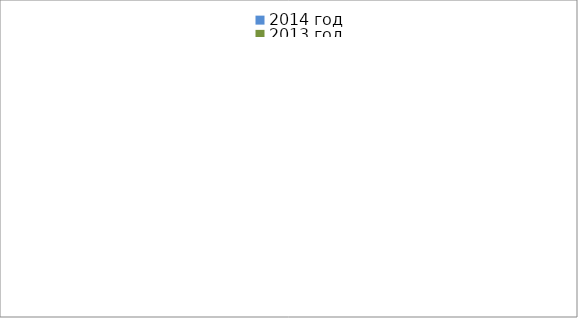
| Category | 2014 год | 2013 год |
|---|---|---|
|  - поджог | 0 | 6 |
|  - неосторожное обращение с огнём | 5 | 6 |
|  - НПТЭ электрооборудования | 2 | 10 |
|  - НПУ и Э печей | 19 | 11 |
|  - НПУ и Э транспортных средств | 18 | 18 |
|   -Шалость с огнем детей | 0 | 1 |
|  -НППБ при эксплуатации эл.приборов | 5 | 8 |
|  - курение | 0 | 1 |
| - прочие | 29 | 20 |
| - не установленные причины | 1 | 1 |